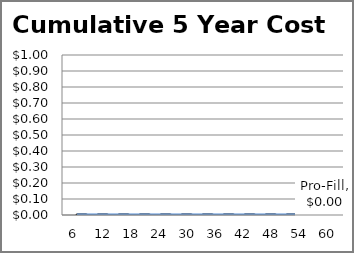
| Category | Manual | Pro-Fill |
|---|---|---|
| 6  | 0 | 0 |
| 12 | 0 | 0 |
| 18 | 0 | 0 |
| 24 | 0 | 0 |
| 30 | 0 | 0 |
| 36 | 0 | 0 |
| 42 | 0 | 0 |
| 48 | 0 | 0 |
| 54 | 0 | 0 |
| 60 | 0 | 0 |